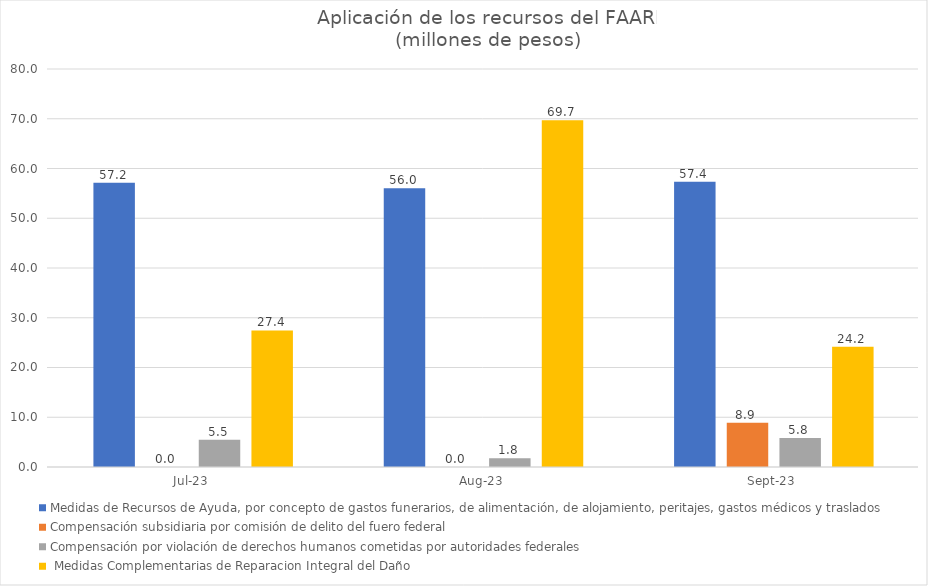
| Category | Medidas de Recursos de Ayuda, por concepto de gastos funerarios, de alimentación, de alojamiento, peritajes, gastos médicos y traslados | Compensación subsidiaria por comisión de delito del fuero federal | Compensación por violación de derechos humanos cometidas por autoridades federales |  Medidas Complementarias de Reparacion Integral del Daño |
|---|---|---|---|---|
| 2023-07-01 | 57.16 | 0 | 5.48 | 27.44 |
| 2023-08-01 | 56.02 | 0 | 1.75 | 69.7 |
| 2023-09-01 | 57.36 | 8.9 | 5.83 | 24.18 |